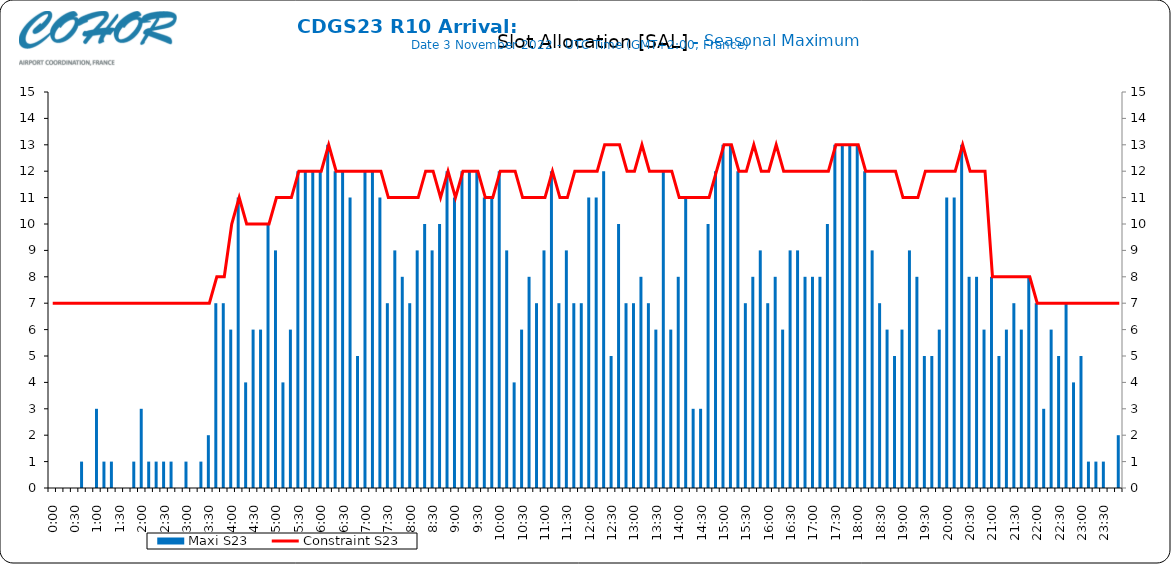
| Category | Maxi S23 |
|---|---|
| 0.0 | 0 |
| 0.006944444444444444 | 0 |
| 0.013888888888888888 | 0 |
| 0.020833333333333332 | 0 |
| 0.027777777777777776 | 1 |
| 0.034722222222222224 | 0 |
| 0.041666666666666664 | 3 |
| 0.04861111111111111 | 1 |
| 0.05555555555555555 | 1 |
| 0.0625 | 0 |
| 0.06944444444444443 | 0 |
| 0.0763888888888889 | 1 |
| 0.08333333333333333 | 3 |
| 0.09027777777777778 | 1 |
| 0.09722222222222222 | 1 |
| 0.10416666666666667 | 1 |
| 0.1111111111111111 | 1 |
| 0.11805555555555557 | 0 |
| 0.125 | 1 |
| 0.13194444444444445 | 0 |
| 0.1388888888888889 | 1 |
| 0.14583333333333334 | 2 |
| 0.15277777777777776 | 7 |
| 0.15972222222222224 | 7 |
| 0.16666666666666666 | 6 |
| 0.17361111111111113 | 11 |
| 0.18055555555555555 | 4 |
| 0.1875 | 6 |
| 0.19444444444444445 | 6 |
| 0.20138888888888887 | 10 |
| 0.20833333333333334 | 9 |
| 0.2152777777777778 | 4 |
| 0.2222222222222222 | 6 |
| 0.22916666666666666 | 12 |
| 0.23611111111111113 | 12 |
| 0.24305555555555555 | 12 |
| 0.25 | 12 |
| 0.2569444444444445 | 13 |
| 0.2638888888888889 | 12 |
| 0.2708333333333333 | 12 |
| 0.2777777777777778 | 11 |
| 0.2847222222222222 | 5 |
| 0.2916666666666667 | 12 |
| 0.2986111111111111 | 12 |
| 0.3055555555555555 | 11 |
| 0.3125 | 7 |
| 0.3194444444444445 | 9 |
| 0.3263888888888889 | 8 |
| 0.3333333333333333 | 7 |
| 0.34027777777777773 | 9 |
| 0.34722222222222227 | 10 |
| 0.3541666666666667 | 9 |
| 0.3611111111111111 | 10 |
| 0.3680555555555556 | 12 |
| 0.375 | 11 |
| 0.3819444444444444 | 12 |
| 0.3888888888888889 | 12 |
| 0.3958333333333333 | 12 |
| 0.40277777777777773 | 11 |
| 0.40972222222222227 | 11 |
| 0.4166666666666667 | 12 |
| 0.4236111111111111 | 9 |
| 0.4305555555555556 | 4 |
| 0.4375 | 6 |
| 0.4444444444444444 | 8 |
| 0.4513888888888889 | 7 |
| 0.4583333333333333 | 9 |
| 0.46527777777777773 | 12 |
| 0.47222222222222227 | 7 |
| 0.4791666666666667 | 9 |
| 0.4861111111111111 | 7 |
| 0.4930555555555556 | 7 |
| 0.5 | 11 |
| 0.5069444444444444 | 11 |
| 0.513888888888889 | 12 |
| 0.5208333333333334 | 5 |
| 0.5277777777777778 | 10 |
| 0.5347222222222222 | 7 |
| 0.5416666666666666 | 7 |
| 0.548611111111111 | 8 |
| 0.5555555555555556 | 7 |
| 0.5625 | 6 |
| 0.5694444444444444 | 12 |
| 0.576388888888889 | 6 |
| 0.5833333333333334 | 8 |
| 0.5902777777777778 | 11 |
| 0.5972222222222222 | 3 |
| 0.6041666666666666 | 3 |
| 0.611111111111111 | 10 |
| 0.6180555555555556 | 12 |
| 0.625 | 13 |
| 0.6319444444444444 | 13 |
| 0.638888888888889 | 12 |
| 0.6458333333333334 | 7 |
| 0.6527777777777778 | 8 |
| 0.6597222222222222 | 9 |
| 0.6666666666666666 | 7 |
| 0.6736111111111112 | 8 |
| 0.6805555555555555 | 6 |
| 0.6875 | 9 |
| 0.6944444444444445 | 9 |
| 0.7013888888888888 | 8 |
| 0.7083333333333334 | 8 |
| 0.7152777777777778 | 8 |
| 0.7222222222222222 | 10 |
| 0.7291666666666666 | 13 |
| 0.7361111111111112 | 13 |
| 0.7430555555555555 | 13 |
| 0.75 | 13 |
| 0.7569444444444445 | 12 |
| 0.7638888888888888 | 9 |
| 0.7708333333333334 | 7 |
| 0.7777777777777778 | 6 |
| 0.7847222222222222 | 5 |
| 0.7916666666666666 | 6 |
| 0.7986111111111112 | 9 |
| 0.8055555555555555 | 8 |
| 0.8125 | 5 |
| 0.8194444444444445 | 5 |
| 0.8263888888888888 | 6 |
| 0.8333333333333334 | 11 |
| 0.8402777777777778 | 11 |
| 0.8472222222222222 | 13 |
| 0.8541666666666666 | 8 |
| 0.8611111111111112 | 8 |
| 0.8680555555555555 | 6 |
| 0.875 | 8 |
| 0.8819444444444445 | 5 |
| 0.8888888888888888 | 6 |
| 0.8958333333333334 | 7 |
| 0.9027777777777778 | 6 |
| 0.9097222222222222 | 8 |
| 0.9166666666666666 | 7 |
| 0.9236111111111112 | 3 |
| 0.9305555555555555 | 6 |
| 0.9375 | 5 |
| 0.9444444444444445 | 7 |
| 0.9513888888888888 | 4 |
| 0.9583333333333334 | 5 |
| 0.9652777777777778 | 1 |
| 0.9722222222222222 | 1 |
| 0.9791666666666666 | 1 |
| 0.9861111111111112 | 0 |
| 0.9930555555555555 | 2 |